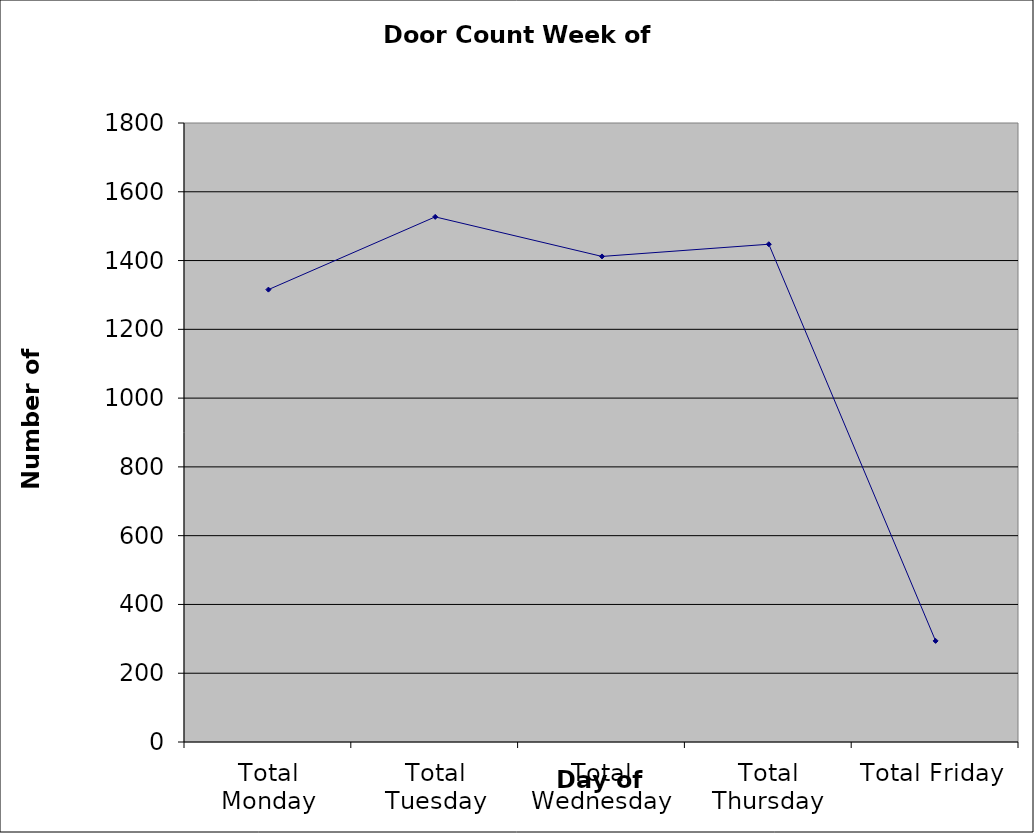
| Category | Series 0 |
|---|---|
| Total Monday | 1315.5 |
| Total Tuesday | 1527 |
| Total Wednesday | 1412 |
| Total Thursday | 1447.5 |
| Total Friday | 294 |